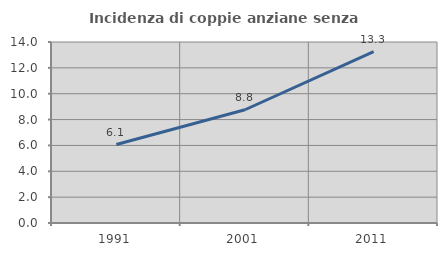
| Category | Incidenza di coppie anziane senza figli  |
|---|---|
| 1991.0 | 6.067 |
| 2001.0 | 8.759 |
| 2011.0 | 13.251 |